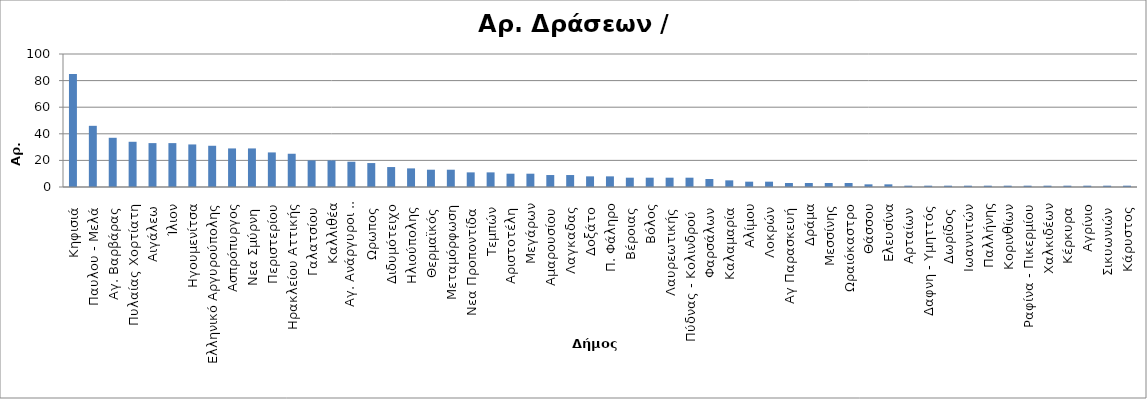
| Category | Αρ. Δράσεων |
|---|---|
| Κηφισιά  | 85 |
| Παυλου - Μελά  | 46 |
| Αγ. Βαρβάρας  | 37 |
| Πυλαίας Χορτίατη | 34 |
| Αιγάλεω  | 33 |
| Ίλιον | 33 |
| Ηγουμενίτσα | 32 |
| Ελληνικό Αργυρούπολης | 31 |
| Ασπρόπυργος | 29 |
| Νεα Σμύρνη  | 29 |
| Περιστερίου | 26 |
| Ηρακλείου Αττικής | 25 |
| Γαλατσίου  | 20 |
| Καλλιθέα | 20 |
| Αγ. Ανάργυροι - Καματερό  | 19 |
| Ωρωπος  | 18 |
| Διδυμότειχο | 15 |
| Ηλιούπολης  | 14 |
| Θερμαϊκός  | 13 |
| Μεταμόρφωση | 13 |
| Νεα Προποντίδα  | 11 |
| Τεμπών  | 11 |
| Αριστοτέλη  | 10 |
| Μεγάρων | 10 |
| Αμαρουσίου  | 9 |
| Λαγκαδας  | 9 |
| Δοξάτο  | 8 |
| Π. Φάληρο | 8 |
| Βέροιας  | 7 |
| Βόλος | 7 |
| Λαυρεωτικής  | 7 |
| Πύδνας - Κολινδρού   | 7 |
| Φαρσάλων  | 6 |
| Καλαμαρία  | 5 |
| Αλίμου | 4 |
| Λοκρών  | 4 |
| Αγ Παρασκευή  | 3 |
| Δράμα | 3 |
| Μεσσίνης | 3 |
| Ωραιόκαστρο | 3 |
| Θάσσου | 2 |
| Ελευσίνα | 2 |
| Αρταίων  | 1 |
| Δαφνη - Υμηττός | 1 |
| Δωρίδος  | 1 |
| Ιωαννιτών | 1 |
| Παλλήνης | 1 |
| Κορινθίων | 1 |
| Ραφίνα - Πικερμίου | 1 |
| Χαλκιδέων | 1 |
| Κέρκυρα  | 1 |
| Αγρίνιο | 1 |
| Σικυωνιών  | 1 |
| Κάρυστος  | 1 |